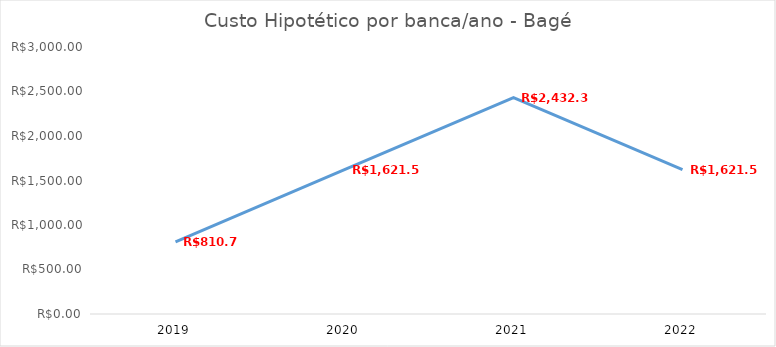
| Category | Series 0 |
|---|---|
| 2019.0 | 810.78 |
| 2020.0 | 1621.56 |
| 2021.0 | 2432.34 |
| 2022.0 | 1621.56 |